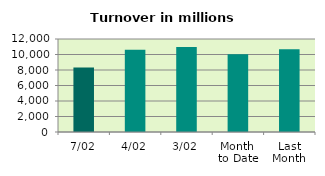
| Category | Series 0 |
|---|---|
| 7/02 | 8306.693 |
| 4/02 | 10598.46 |
| 3/02 | 10968.403 |
| Month 
to Date | 10019.497 |
| Last
Month | 10672.471 |